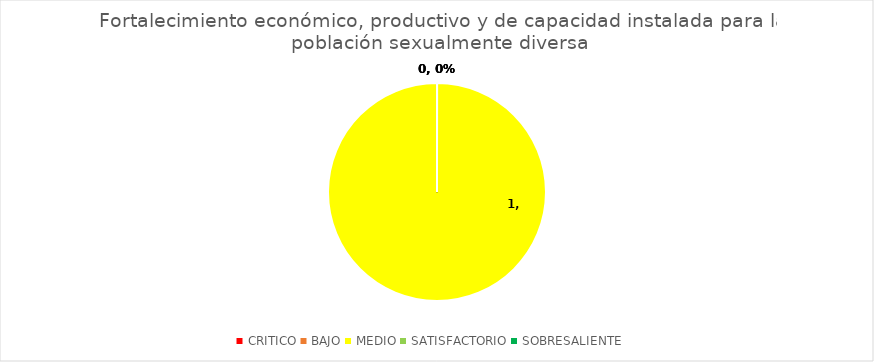
| Category | Fortalecimiento económico, productivo y de capacidad instalada para la población sexualmente diversa |
|---|---|
| CRITICO | 0 |
| BAJO | 0 |
| MEDIO | 1 |
| SATISFACTORIO | 0 |
| SOBRESALIENTE | 0 |